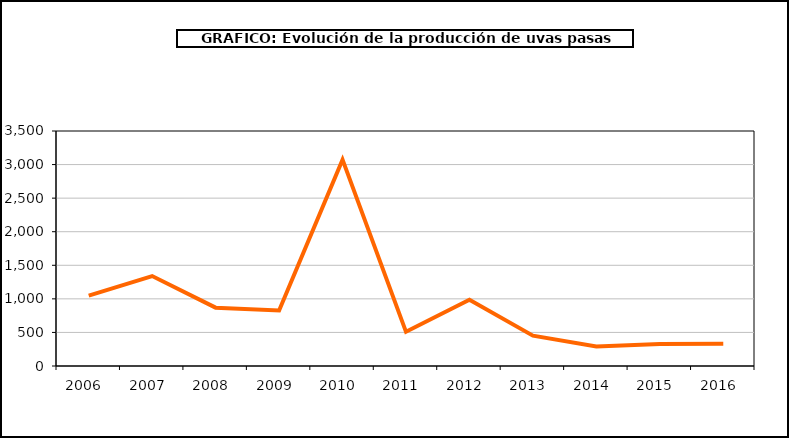
| Category | producción |
|---|---|
| 2006.0 | 1049 |
| 2007.0 | 1340 |
| 2008.0 | 869 |
| 2009.0 | 828 |
| 2010.0 | 3073 |
| 2011.0 | 509 |
| 2012.0 | 986 |
| 2013.0 | 452 |
| 2014.0 | 289 |
| 2015.0 | 328 |
| 2016.0 | 332 |